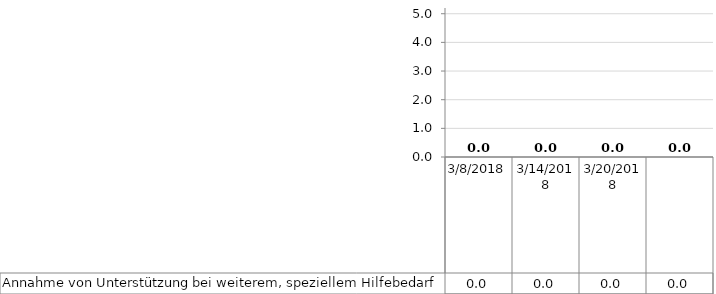
| Category | Annahme von Unterstützung bei weiterem, speziellem Hilfebedarf |
|---|---|
| 08.03.2018 | 0 |
| 14.03.2018 | 0 |
| 20.03.2018 | 0 |